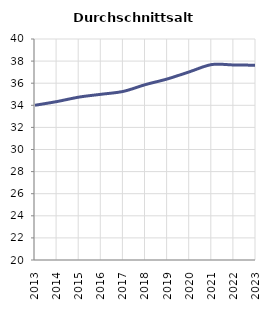
| Category | Durchschnittsalter |
|---|---|
| 2013.0 | 34.003 |
| 2014.0 | 34.342 |
| 2015.0 | 34.745 |
| 2016.0 | 34.999 |
| 2017.0 | 35.261 |
| 2018.0 | 35.874 |
| 2019.0 | 36.392 |
| 2020.0 | 37.04 |
| 2021.0 | 37.688 |
| 2022.0 | 37.65 |
| 2023.0 | 37.628 |